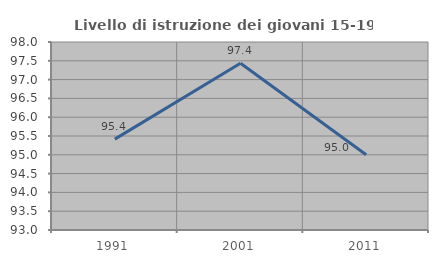
| Category | Livello di istruzione dei giovani 15-19 anni |
|---|---|
| 1991.0 | 95.418 |
| 2001.0 | 97.436 |
| 2011.0 | 95 |